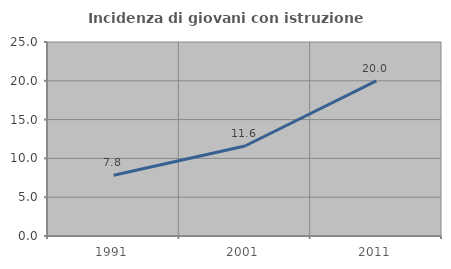
| Category | Incidenza di giovani con istruzione universitaria |
|---|---|
| 1991.0 | 7.834 |
| 2001.0 | 11.597 |
| 2011.0 | 20 |